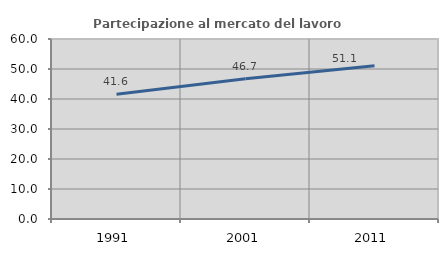
| Category | Partecipazione al mercato del lavoro  femminile |
|---|---|
| 1991.0 | 41.585 |
| 2001.0 | 46.729 |
| 2011.0 | 51.097 |